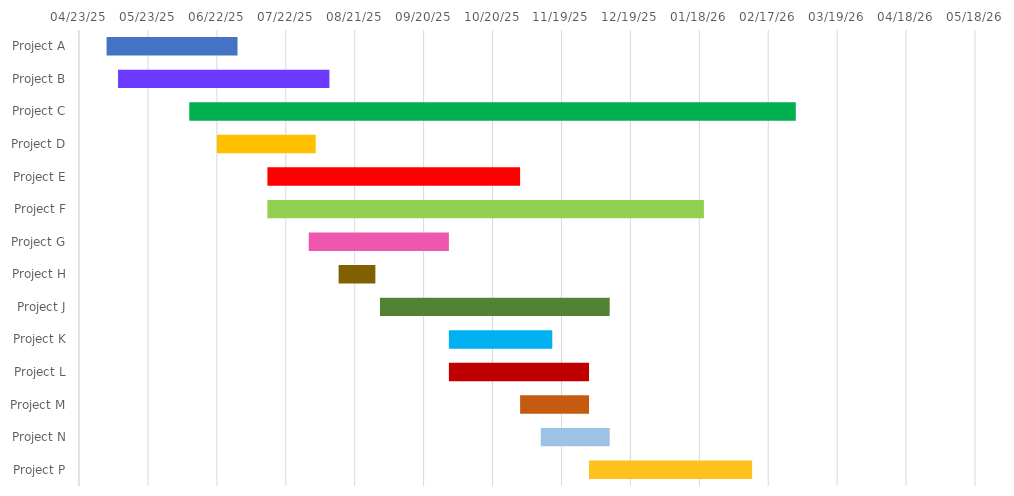
| Category | BEGIN | Duration |
|---|---|---|
| Project A | 2025-05-05 | 57 |
| Project B | 2025-05-10 | 92 |
| Project C | 2025-06-10 | 264 |
| Project D | 2025-06-22 | 43 |
| Project E | 2025-07-14 | 110 |
| Project F | 2025-07-14 | 190 |
| Project G | 2025-08-01 | 61 |
| Project H | 2025-08-14 | 16 |
| Project J | 2025-09-01 | 100 |
| Project K | 2025-10-01 | 45 |
| Project L | 2025-10-01 | 61 |
| Project M | 2025-11-01 | 30 |
| Project N | 2025-11-10 | 30 |
| Project P | 2025-12-01 | 71 |